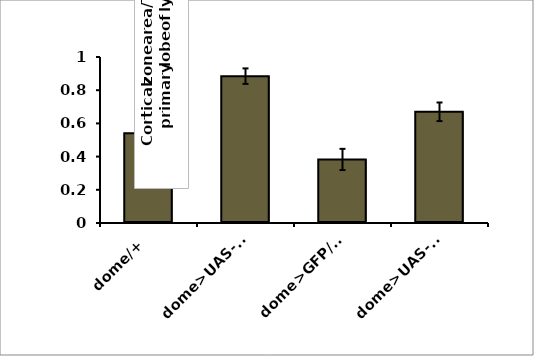
| Category | Series 0 |
|---|---|
| dome/+ | 0.54 |
| dome>UAS-FOXO | 0.885 |
| dome>GFP/+; whd1/+ | 0.383 |
| dome>UAS-FOXO/ whd1 | 0.67 |